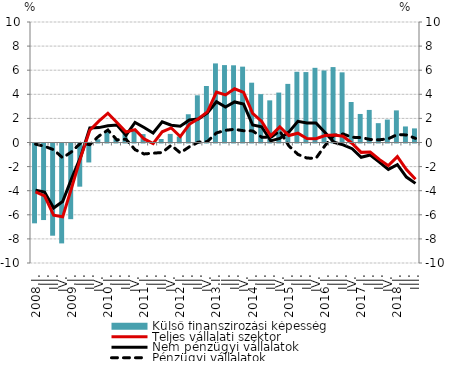
| Category | Külső finanszírozási képesség |
|---|---|
| 2008.I. | -6.625 |
| II. | -6.353 |
| III. | -7.652 |
| IV. | -8.291 |
| 2009.I. | -6.28 |
| II. | -3.583 |
| III. | -1.573 |
| IV. | 0.266 |
| 2010.I. | 0.868 |
| II. | 0.342 |
| III. | 0.707 |
| IV. | 1.118 |
| 2011.I. | 0.698 |
| II. | -0.018 |
| III. | 0.289 |
| IV. | 0.713 |
| 2012.I. | 0.498 |
| II. | 2.345 |
| III. | 3.916 |
| IV. | 4.688 |
| 2013.I. | 6.563 |
| II. | 6.424 |
| III. | 6.407 |
| IV. | 6.295 |
| 2014.I. | 4.964 |
| II. | 4.015 |
| III. | 3.498 |
| IV. | 4.142 |
| 2015.I. | 4.864 |
| II. | 5.87 |
| III. | 5.844 |
| IV. | 6.197 |
| 2016.I. | 5.979 |
| II. | 6.259 |
| III. | 5.823 |
| IV. | 3.36 |
| 2017.I. | 2.368 |
| II. | 2.703 |
| III. | 1.605 |